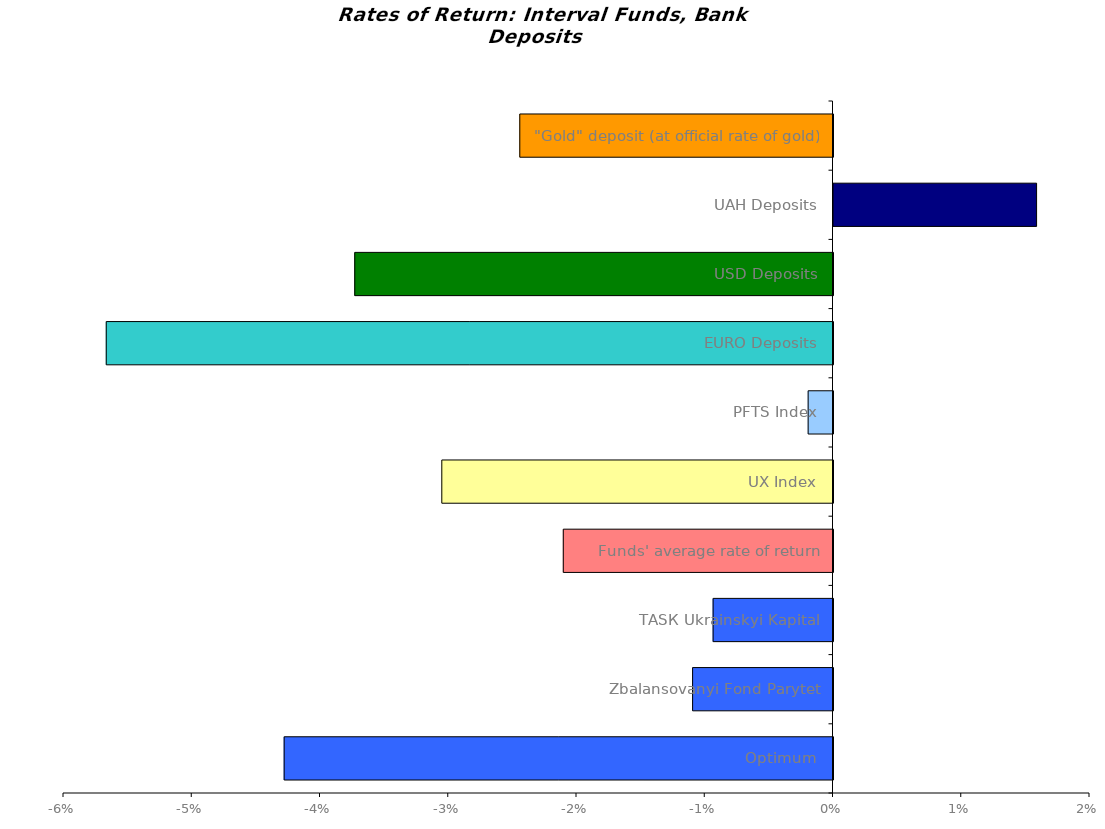
| Category | Series 0 |
|---|---|
| Optimum | -0.043 |
| Zbalansovanyi Fond Parytet | -0.011 |
| ТАSК Ukrainskyi Kapital | -0.009 |
| Funds' average rate of return | -0.021 |
| UX Index | -0.031 |
| PFTS Index | -0.002 |
| EURO Deposits | -0.057 |
| USD Deposits | -0.037 |
| UAH Deposits | 0.016 |
| "Gold" deposit (at official rate of gold) | -0.024 |